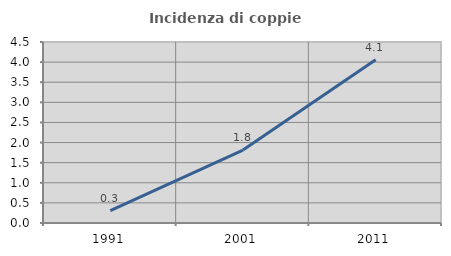
| Category | Incidenza di coppie miste |
|---|---|
| 1991.0 | 0.309 |
| 2001.0 | 1.814 |
| 2011.0 | 4.056 |